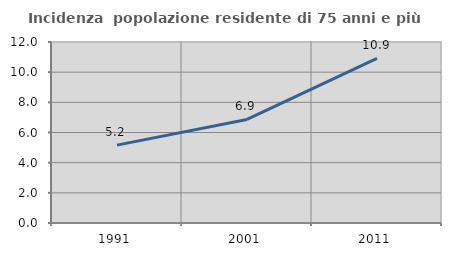
| Category | Incidenza  popolazione residente di 75 anni e più |
|---|---|
| 1991.0 | 5.164 |
| 2001.0 | 6.866 |
| 2011.0 | 10.913 |